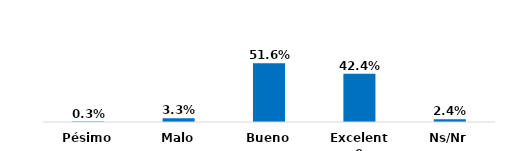
| Category | Series 0 |
|---|---|
| Pésimo | 0.003 |
| Malo | 0.033 |
| Bueno | 0.516 |
| Excelente | 0.424 |
| Ns/Nr | 0.024 |